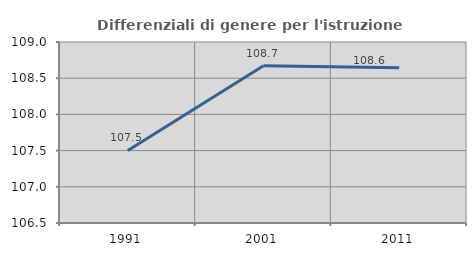
| Category | Differenziali di genere per l'istruzione superiore |
|---|---|
| 1991.0 | 107.501 |
| 2001.0 | 108.671 |
| 2011.0 | 108.644 |